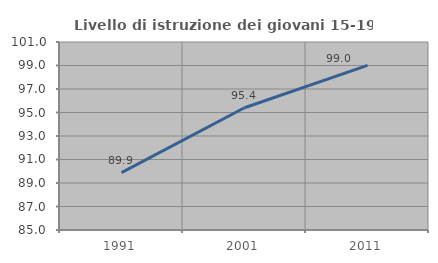
| Category | Livello di istruzione dei giovani 15-19 anni |
|---|---|
| 1991.0 | 89.888 |
| 2001.0 | 95.402 |
| 2011.0 | 99.017 |